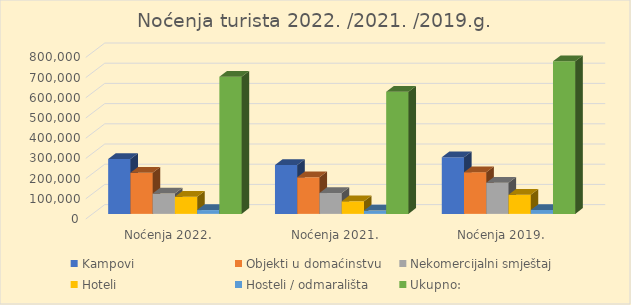
| Category | Kampovi | Objekti u domaćinstvu | Nekomercijalni smještaj | Hoteli | Hosteli / odmarališta | Ukupno: |
|---|---|---|---|---|---|---|
| Noćenja 2022. | 271472 | 203148 | 100528 | 84598 | 18776 | 678522 |
| Noćenja 2021. | 241513 | 181028 | 103161 | 62142 | 16107 | 603951 |
| Noćenja 2019. | 280817 | 206343 | 154380 | 94667 | 19603 | 755810 |